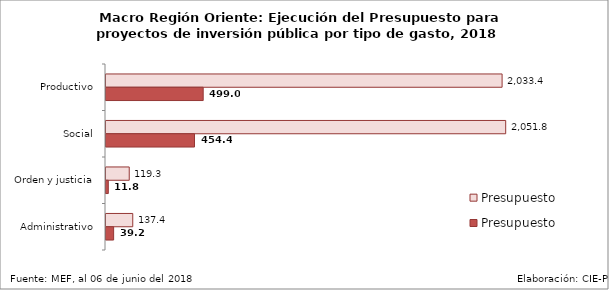
| Category | Presupuesto | Presupuesto Ejecutado |
|---|---|---|
| Productivo | 2033.409 | 498.971 |
| Social | 2051.831 | 454.382 |
| Orden y justicia | 119.294 | 11.846 |
| Administrativo | 137.351 | 39.188 |